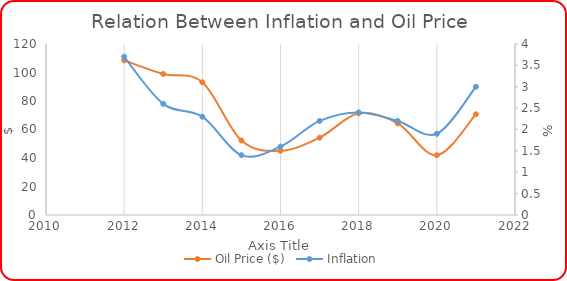
| Category |  Oil Price ($)  |
|---|---|
| 2021.0 | 70.68 |
| 2020.0 | 41.96 |
| 2019.0 | 64.3 |
| 2018.0 | 71.34 |
| 2017.0 | 54.25 |
| 2016.0 | 45.07 |
| 2015.0 | 52.32 |
| 2014.0 | 93.17 |
| 2013.0 | 98.97 |
| 2012.0 | 108.56 |